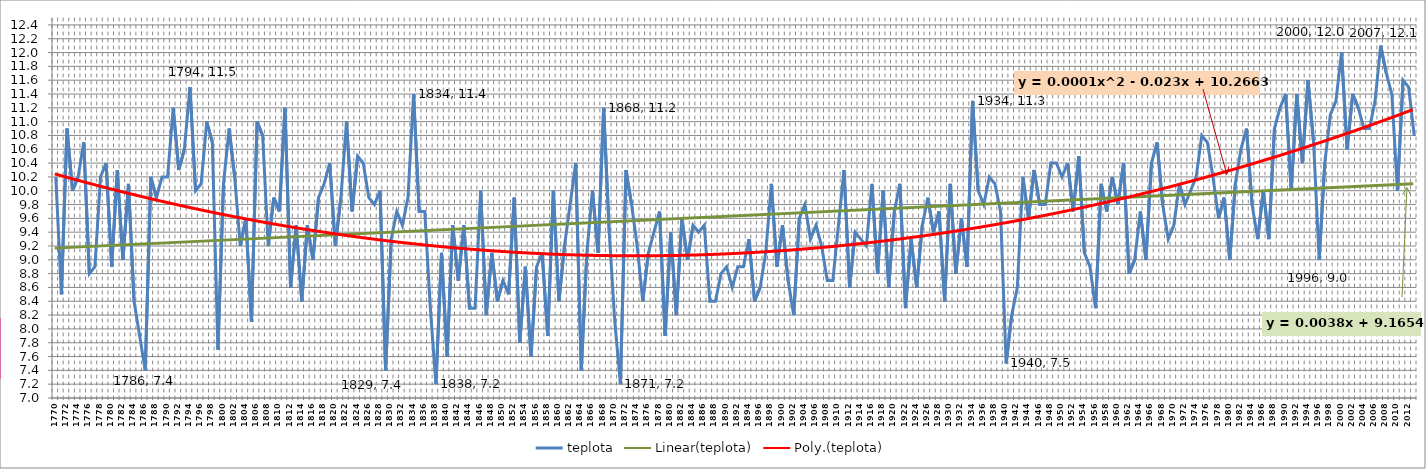
| Category | teplota |
|---|---|
| 1770.0 | 10.2 |
| 1771.0 | 8.5 |
| 1772.0 | 10.9 |
| 1773.0 | 10 |
| 1774.0 | 10.2 |
| 1775.0 | 10.7 |
| 1776.0 | 8.8 |
| 1777.0 | 8.9 |
| 1778.0 | 10.2 |
| 1779.0 | 10.4 |
| 1780.0 | 8.9 |
| 1781.0 | 10.3 |
| 1782.0 | 9 |
| 1783.0 | 10.1 |
| 1784.0 | 8.4 |
| 1785.0 | 7.9 |
| 1786.0 | 7.4 |
| 1787.0 | 10.2 |
| 1788.0 | 9.9 |
| 1789.0 | 10.2 |
| 1790.0 | 10.2 |
| 1791.0 | 11.2 |
| 1792.0 | 10.3 |
| 1793.0 | 10.6 |
| 1794.0 | 11.5 |
| 1795.0 | 10 |
| 1796.0 | 10.1 |
| 1797.0 | 11 |
| 1798.0 | 10.7 |
| 1799.0 | 7.7 |
| 1800.0 | 10.1 |
| 1801.0 | 10.9 |
| 1802.0 | 10.2 |
| 1803.0 | 9.2 |
| 1804.0 | 9.6 |
| 1805.0 | 8.1 |
| 1806.0 | 11 |
| 1807.0 | 10.8 |
| 1808.0 | 9.2 |
| 1809.0 | 9.9 |
| 1810.0 | 9.7 |
| 1811.0 | 11.2 |
| 1812.0 | 8.6 |
| 1813.0 | 9.5 |
| 1814.0 | 8.4 |
| 1815.0 | 9.5 |
| 1816.0 | 9 |
| 1817.0 | 9.9 |
| 1818.0 | 10.1 |
| 1819.0 | 10.4 |
| 1820.0 | 9.2 |
| 1821.0 | 9.9 |
| 1822.0 | 11 |
| 1823.0 | 9.7 |
| 1824.0 | 10.5 |
| 1825.0 | 10.4 |
| 1826.0 | 9.9 |
| 1827.0 | 9.8 |
| 1828.0 | 10 |
| 1829.0 | 7.4 |
| 1830.0 | 9.3 |
| 1831.0 | 9.7 |
| 1832.0 | 9.5 |
| 1833.0 | 9.9 |
| 1834.0 | 11.4 |
| 1835.0 | 9.7 |
| 1836.0 | 9.7 |
| 1837.0 | 8.3 |
| 1838.0 | 7.2 |
| 1839.0 | 9.1 |
| 1840.0 | 7.6 |
| 1841.0 | 9.5 |
| 1842.0 | 8.7 |
| 1843.0 | 9.5 |
| 1844.0 | 8.3 |
| 1845.0 | 8.3 |
| 1846.0 | 10 |
| 1847.0 | 8.2 |
| 1848.0 | 9.1 |
| 1849.0 | 8.4 |
| 1850.0 | 8.7 |
| 1851.0 | 8.5 |
| 1852.0 | 9.9 |
| 1853.0 | 7.8 |
| 1854.0 | 8.9 |
| 1855.0 | 7.6 |
| 1856.0 | 8.9 |
| 1857.0 | 9.1 |
| 1858.0 | 7.9 |
| 1859.0 | 10 |
| 1860.0 | 8.4 |
| 1861.0 | 9.2 |
| 1862.0 | 9.8 |
| 1863.0 | 10.4 |
| 1864.0 | 7.4 |
| 1865.0 | 9.1 |
| 1866.0 | 10 |
| 1867.0 | 9.1 |
| 1868.0 | 11.2 |
| 1869.0 | 9.4 |
| 1870.0 | 8.1 |
| 1871.0 | 7.2 |
| 1872.0 | 10.3 |
| 1873.0 | 9.8 |
| 1874.0 | 9.2 |
| 1875.0 | 8.4 |
| 1876.0 | 9.1 |
| 1877.0 | 9.4 |
| 1878.0 | 9.7 |
| 1879.0 | 7.9 |
| 1880.0 | 9.4 |
| 1881.0 | 8.2 |
| 1882.0 | 9.6 |
| 1883.0 | 9 |
| 1884.0 | 9.5 |
| 1885.0 | 9.4 |
| 1886.0 | 9.5 |
| 1887.0 | 8.4 |
| 1888.0 | 8.4 |
| 1889.0 | 8.8 |
| 1890.0 | 8.9 |
| 1891.0 | 8.6 |
| 1892.0 | 8.9 |
| 1893.0 | 8.9 |
| 1894.0 | 9.3 |
| 1895.0 | 8.4 |
| 1896.0 | 8.6 |
| 1897.0 | 9.1 |
| 1898.0 | 10.1 |
| 1899.0 | 8.9 |
| 1900.0 | 9.5 |
| 1901.0 | 8.7 |
| 1902.0 | 8.2 |
| 1903.0 | 9.6 |
| 1904.0 | 9.8 |
| 1905.0 | 9.3 |
| 1906.0 | 9.5 |
| 1907.0 | 9.2 |
| 1908.0 | 8.7 |
| 1909.0 | 8.7 |
| 1910.0 | 9.5 |
| 1911.0 | 10.3 |
| 1912.0 | 8.6 |
| 1913.0 | 9.4 |
| 1914.0 | 9.3 |
| 1915.0 | 9.2 |
| 1916.0 | 10.1 |
| 1917.0 | 8.8 |
| 1918.0 | 10 |
| 1919.0 | 8.6 |
| 1920.0 | 9.7 |
| 1921.0 | 10.1 |
| 1922.0 | 8.3 |
| 1923.0 | 9.3 |
| 1924.0 | 8.6 |
| 1925.0 | 9.5 |
| 1926.0 | 9.9 |
| 1927.0 | 9.4 |
| 1928.0 | 9.7 |
| 1929.0 | 8.4 |
| 1930.0 | 10.1 |
| 1931.0 | 8.8 |
| 1932.0 | 9.6 |
| 1933.0 | 8.9 |
| 1934.0 | 11.3 |
| 1935.0 | 10 |
| 1936.0 | 9.8 |
| 1937.0 | 10.2 |
| 1938.0 | 10.1 |
| 1939.0 | 9.7 |
| 1940.0 | 7.5 |
| 1941.0 | 8.2 |
| 1942.0 | 8.6 |
| 1943.0 | 10.2 |
| 1944.0 | 9.6 |
| 1945.0 | 10.3 |
| 1946.0 | 9.8 |
| 1947.0 | 9.8 |
| 1948.0 | 10.4 |
| 1949.0 | 10.4 |
| 1950.0 | 10.2 |
| 1951.0 | 10.4 |
| 1952.0 | 9.7 |
| 1953.0 | 10.5 |
| 1954.0 | 9.1 |
| 1955.0 | 8.9 |
| 1956.0 | 8.3 |
| 1957.0 | 10.1 |
| 1958.0 | 9.7 |
| 1959.0 | 10.2 |
| 1960.0 | 9.8 |
| 1961.0 | 10.4 |
| 1962.0 | 8.8 |
| 1963.0 | 9 |
| 1964.0 | 9.7 |
| 1965.0 | 9 |
| 1966.0 | 10.4 |
| 1967.0 | 10.7 |
| 1968.0 | 9.8 |
| 1969.0 | 9.3 |
| 1970.0 | 9.5 |
| 1971.0 | 10.1 |
| 1972.0 | 9.8 |
| 1973.0 | 10 |
| 1974.0 | 10.2 |
| 1975.0 | 10.8 |
| 1976.0 | 10.7 |
| 1977.0 | 10.2 |
| 1978.0 | 9.6 |
| 1979.0 | 9.9 |
| 1980.0 | 9 |
| 1981.0 | 10.1 |
| 1982.0 | 10.6 |
| 1983.0 | 10.9 |
| 1984.0 | 9.8 |
| 1985.0 | 9.3 |
| 1986.0 | 10 |
| 1987.0 | 9.3 |
| 1988.0 | 10.9 |
| 1989.0 | 11.2 |
| 1990.0 | 11.4 |
| 1991.0 | 10 |
| 1992.0 | 11.4 |
| 1993.0 | 10.4 |
| 1994.0 | 11.6 |
| 1995.0 | 10.7 |
| 1996.0 | 9 |
| 1997.0 | 10.4 |
| 1998.0 | 11.1 |
| 1999.0 | 11.3 |
| 2000.0 | 12 |
| 2001.0 | 10.6 |
| 2002.0 | 11.4 |
| 2003.0 | 11.2 |
| 2004.0 | 10.9 |
| 2005.0 | 10.9 |
| 2006.0 | 11.3 |
| 2007.0 | 12.1 |
| 2008.0 | 11.7 |
| 2009.0 | 11.4 |
| 2010.0 | 10 |
| 2011.0 | 11.6 |
| 2012.0 | 11.5 |
| 2013.0 | 10.8 |